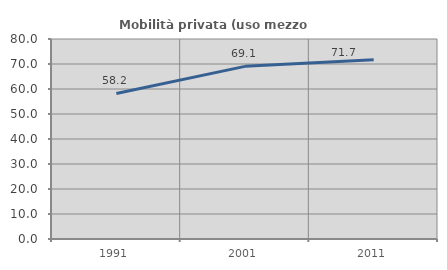
| Category | Mobilità privata (uso mezzo privato) |
|---|---|
| 1991.0 | 58.214 |
| 2001.0 | 69.063 |
| 2011.0 | 71.706 |